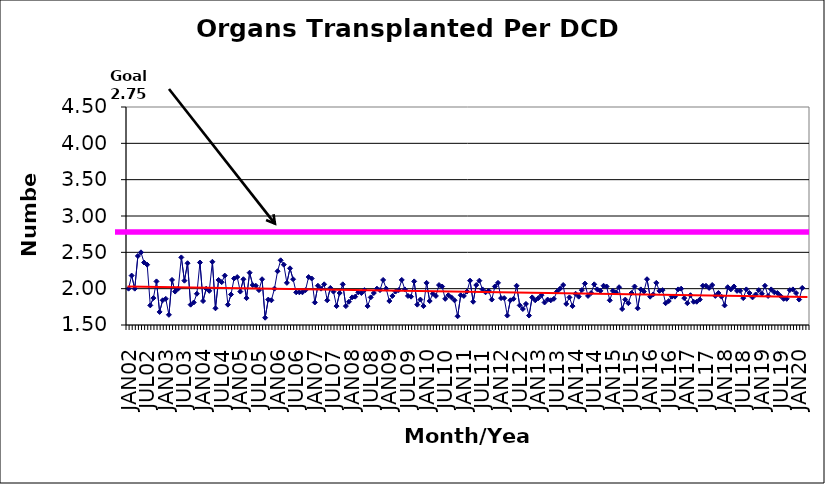
| Category | Series 0 |
|---|---|
| JAN02 | 2 |
| FEB02 | 2.18 |
| MAR02 | 2 |
| APR02 | 2.45 |
| MAY02 | 2.5 |
| JUN02 | 2.36 |
| JUL02 | 2.33 |
| AUG02 | 1.77 |
| SEP02 | 1.87 |
| OCT02 | 2.1 |
| NOV02 | 1.68 |
| DEC02 | 1.84 |
| JAN03 | 1.86 |
| FEB03 | 1.64 |
| MAR03 | 2.12 |
| APR03 | 1.96 |
| MAY03 | 2 |
| JUN03 | 2.43 |
| JUL03 | 2.11 |
| AUG03 | 2.35 |
| SEP03 | 1.78 |
| OCT03 | 1.81 |
| NOV03 | 1.93 |
| DEC03 | 2.36 |
| JAN04 | 1.83 |
| FEB04 | 2 |
| MAR04 | 1.97 |
| APR04 | 2.37 |
| MAY04 | 1.73 |
| JUN04 | 2.12 |
| JUL04 | 2.09 |
| AUG04 | 2.18 |
| SEP04 | 1.78 |
| OCT04 | 1.92 |
| NOV04 | 2.14 |
| DEC04 | 2.16 |
| JAN05 | 1.96 |
| FEB05 | 2.13 |
| MAR05 | 1.87 |
| APR05 | 2.22 |
| MAY05 | 2.05 |
| JUN05 | 2.04 |
| JUL05 | 1.98 |
| AUG05 | 2.13 |
| SEP05 | 1.6 |
| OCT05 | 1.85 |
| NOV05 | 1.84 |
| DEC05 | 2 |
| JAN06 | 2.24 |
| FEB06 | 2.39 |
| MAR06 | 2.33 |
| APR06 | 2.08 |
| MAY06 | 2.28 |
| JUN06 | 2.13 |
| JUL06 | 1.95 |
| AUG06 | 1.95 |
| SEP06 | 1.95 |
| OCT06 | 1.98 |
| NOV06 | 2.16 |
| DEC06 | 2.14 |
| JAN07 | 1.81 |
| FEB07 | 2.04 |
| MAR07 | 2 |
| APR07 | 2.06 |
| MAY07 | 1.84 |
| JUN07 | 2.01 |
| JUL07 | 1.96 |
| AUG07 | 1.76 |
| SEP07 | 1.94 |
| OCT07 | 2.06 |
| NOV07 | 1.76 |
| DEC07 | 1.82 |
| JAN08 | 1.88 |
| FEB08 | 1.89 |
| MAR08 | 1.95 |
| APR08 | 1.94 |
| MAY08 | 1.98 |
| JUN08 | 1.76 |
| JUL08 | 1.88 |
| AUG08 | 1.94 |
| SEP08 | 2 |
| OCT08 | 1.98 |
| NOV08 | 2.12 |
| DEC08 | 2 |
| JAN09 | 1.83 |
| FEB09 | 1.9 |
| MAR09 | 1.96 |
| APR09 | 1.98 |
| MAY09 | 2.12 |
| JUN09 | 1.99 |
| JUL09 | 1.9 |
| AUG09 | 1.89 |
| SEP09 | 2.1 |
| OCT09 | 1.78 |
| NOV09 | 1.85 |
| DEC09 | 1.76 |
| JAN10 | 2.08 |
| FEB10 | 1.83 |
| MAR10 | 1.93 |
| APR10 | 1.9 |
| MAY10 | 2.05 |
| JUN10 | 2.03 |
| JUL10 | 1.86 |
| AUG10 | 1.91 |
| SEP10 | 1.88 |
| OCT10 | 1.84 |
| NOV10 | 1.62 |
| DEC10 | 1.91 |
| JAN11 | 1.9 |
| FEB11 | 1.96 |
| MAR11 | 2.11 |
| APR11 | 1.82 |
| MAY11 | 2.05 |
| JUN11 | 2.11 |
| JUL11 | 1.99 |
| AUG11 | 1.95 |
| SEP11 | 1.97 |
| OCT11 | 1.85 |
| NOV11 | 2.03 |
| DEC11 | 2.08 |
| JAN12 | 1.87 |
| FEB12 | 1.87 |
| MAR12 | 1.63 |
| APR12 | 1.84 |
| MAY12 | 1.86 |
| JUN12 | 2.04 |
| JUL12 | 1.77 |
| AUG12 | 1.72 |
| SEP12 | 1.79 |
| OCT12 | 1.63 |
| NOV12 | 1.88 |
| DEC12 | 1.84 |
| JAN13 | 1.87 |
| FEB13 | 1.91 |
| MAR13 | 1.81 |
| APR13 | 1.85 |
| MAY13 | 1.84 |
| JUN13 | 1.86 |
| JUL13 | 1.96 |
| AUG13 | 2 |
| SEP13 | 2.05 |
| OCT13 | 1.79 |
| NOV13 | 1.88 |
| DEC13 | 1.76 |
| JAN14 | 1.93 |
| FEB14 | 1.89 |
| MAR14 | 1.98 |
| APR14 | 2.07 |
| MAY14 | 1.9 |
| JUN14 | 1.94 |
| JUL14 | 2.06 |
| AUG14 | 1.99 |
| SEP14 | 1.97 |
| OCT14 | 2.04 |
| NOV14 | 2.03 |
| DEC14 | 1.84 |
| JAN15 | 1.97 |
| FEB15 | 1.95 |
| MAR15 | 2.02 |
| APR15 | 1.72 |
| MAY15 | 1.85 |
| JUN15 | 1.8 |
| JUL15 | 1.94 |
| AUG15 | 2.03 |
| SEP15 | 1.73 |
| OCT15 | 1.99 |
| NOV15 | 1.96 |
| DEC15 | 2.13 |
| JAN16 | 1.89 |
| FEB16 | 1.92 |
| MAR16 | 2.08 |
| APR16 | 1.97 |
| MAY16 | 1.98 |
| JUN16 | 1.8 |
| JUL16 | 1.83 |
| AUG16 | 1.89 |
| SEP16 | 1.89 |
| OCT16 | 1.99 |
| NOV16 | 2 |
| DEC16 | 1.87 |
| JAN17 | 1.8 |
| FEB17 | 1.91 |
| MAR17 | 1.82 |
| APR17 | 1.82 |
| MAY17 | 1.85 |
| JUN17 | 2.04 |
| JUL17 | 2.04 |
| AUG17 | 2.01 |
| SEP17 | 2.05 |
| OCT17 | 1.9 |
| NOV17 | 1.94 |
| DEC17 | 1.89 |
| JAN18 | 1.77 |
| FEB18 | 2.02 |
| MAR18 | 1.99 |
| APR18 | 2.03 |
| MAY18 | 1.97 |
| JUN18 | 1.97 |
| JUL18 | 1.87 |
| AUG18 | 1.99 |
| SEP18 | 1.94 |
| OCT18 | 1.88 |
| NOV18 | 1.92 |
| DEC18 | 1.98 |
| JAN19 | 1.93 |
| FEB19 | 2.04 |
| MAR19 | 1.9 |
| APR19 | 1.99 |
| MAY19 | 1.95 |
| JUN19 | 1.94 |
| JUL19 | 1.9 |
| AUG19 | 1.86 |
| SEP19 | 1.86 |
| OCT19 | 1.98 |
| NOV19 | 1.99 |
| DEC19 | 1.94 |
| JAN20 | 1.85 |
| FEB20 | 2.01 |